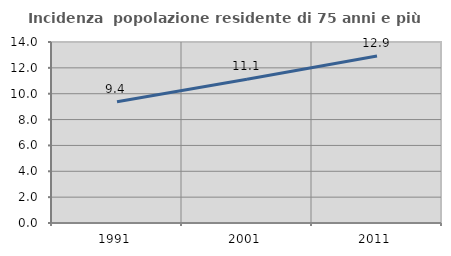
| Category | Incidenza  popolazione residente di 75 anni e più |
|---|---|
| 1991.0 | 9.379 |
| 2001.0 | 11.111 |
| 2011.0 | 12.924 |